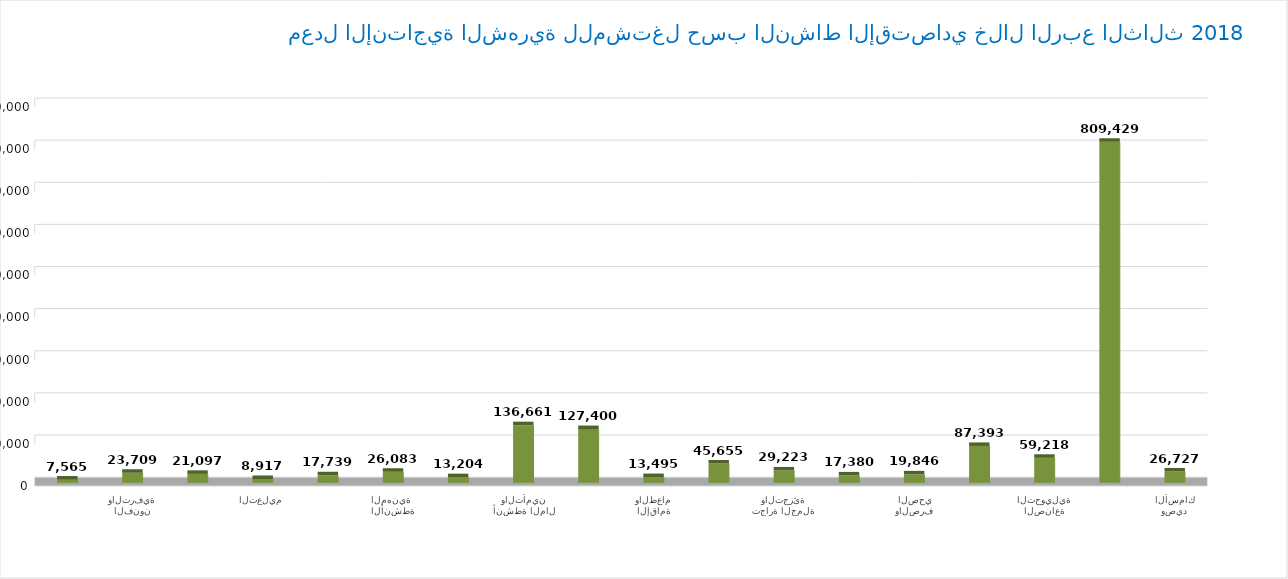
| Category | إنتاجية المشتغل  |
|---|---|
| الزراعة والحراجة وصيد الأسماك | 26727.037 |
| التعدين واستغلال المحاجر | 809428.971 |
| الصناعة التحويلية | 59217.791 |
| توصيل الكهرباء والغاز  | 87393.445 |
| امدادات الماء والصرف الصحي | 19845.601 |
| التشييد | 17380.38 |
| تجارة الجملة والتجزئة | 29222.863 |
| النقل والتخزين | 45654.523 |
| الإقامة والطعام | 13495.077 |
| المعلومات والاتصالات | 127399.753 |
| أنشطة المال والتأمين | 136660.652 |
| الأنشطة العقارية | 13204.434 |
| الأنشطة المهنية  | 26083.488 |
| الخدمات الإدارية والدعم | 17738.843 |
| التعليم | 8917.395 |
| الصحة والعمل الاجتماعي | 21096.765 |
| الفنون والترفية | 23709.009 |
| الخدمات الأخرى | 7565.328 |